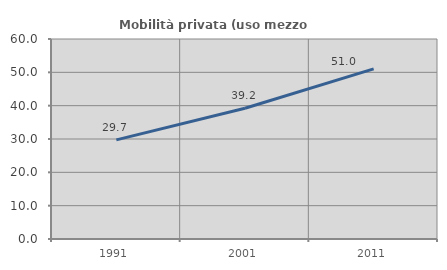
| Category | Mobilità privata (uso mezzo privato) |
|---|---|
| 1991.0 | 29.741 |
| 2001.0 | 39.229 |
| 2011.0 | 51.048 |